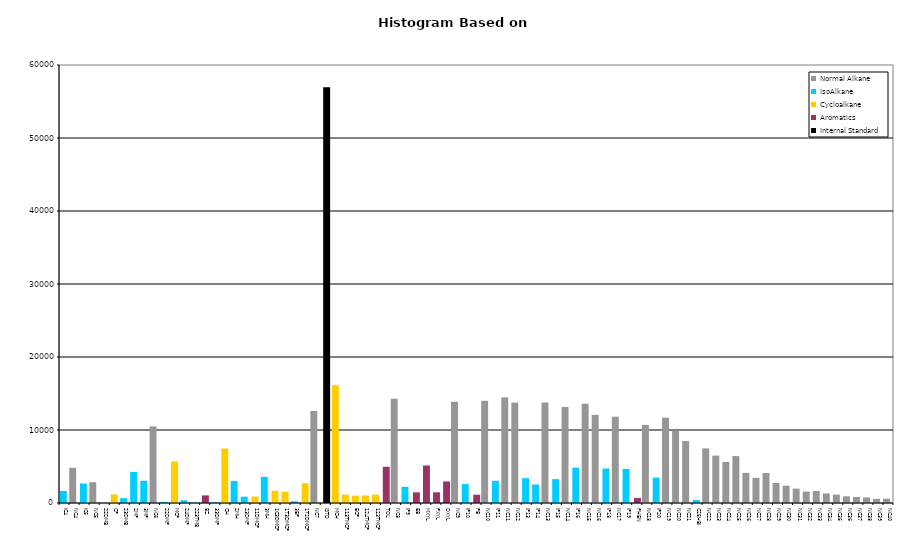
| Category | Normal Alkane | IsoAlkane | Cycloalkane | Aromatics | Internal Standard |
|---|---|---|---|---|---|
| IC4 | 0 | 1652 | 0 | 0 | 0 |
| NC4 | 4818 | 0 | 0 | 0 | 0 |
| IC5 | 0 | 2674 | 0 | 0 | 0 |
| NC5 | 2843 | 0 | 0 | 0 | 0 |
| 22DMB | 0 | 0 | 0 | 0 | 0 |
| CP | 0 | 0 | 1186 | 0 | 0 |
| 23DMB | 0 | 660 | 0 | 0 | 0 |
| 2MP | 0 | 4242 | 0 | 0 | 0 |
| 3MP | 0 | 3038 | 0 | 0 | 0 |
| NC6 | 10497 | 0 | 0 | 0 | 0 |
| 22DMP | 0 | 163 | 0 | 0 | 0 |
| MCP | 0 | 0 | 5683 | 0 | 0 |
| 24DMP | 0 | 377 | 0 | 0 | 0 |
| 223TMB | 0 | 57 | 0 | 0 | 0 |
| BZ | 0 | 0 | 0 | 1045 | 0 |
| 33DMP | 0 | 132 | 0 | 0 | 0 |
| CH | 0 | 0 | 7453 | 0 | 0 |
| 2MH | 0 | 3028 | 0 | 0 | 0 |
| 23DMP | 0 | 865 | 0 | 0 | 0 |
| 11DMCP | 0 | 0 | 888 | 0 | 0 |
| 3MH | 0 | 3582 | 0 | 0 | 0 |
| 1C3DMCP | 0 | 0 | 1687 | 0 | 0 |
| 1T3DMCP | 0 | 0 | 1529 | 0 | 0 |
| 3EP | 0 | 247 | 0 | 0 | 0 |
| 1T2DMCP | 0 | 0 | 2718 | 0 | 0 |
| NC7 | 12605 | 0 | 0 | 0 | 0 |
| ISTD | 0 | 0 | 0 | 0 | 56946 |
| MCH | 0 | 0 | 16136 | 0 | 0 |
| 113TMCP | 0 | 0 | 1162 | 0 | 0 |
| ECP | 0 | 0 | 1008 | 0 | 0 |
| 124TMCP | 0 | 0 | 1038 | 0 | 0 |
| 123TMCP | 0 | 0 | 1155 | 0 | 0 |
| TOL | 0 | 0 | 0 | 4962 | 0 |
| NC8 | 14287 | 0 | 0 | 0 | 0 |
| IP9 | 0 | 2217 | 0 | 0 | 0 |
| EB | 0 | 0 | 0 | 1460 | 0 |
| MXYL | 0 | 0 | 0 | 5137 | 0 |
| PXYL | 0 | 0 | 0 | 1464 | 0 |
| OXYL | 0 | 0 | 0 | 2949 | 0 |
| NC9 | 13864 | 0 | 0 | 0 | 0 |
| IP10 | 0 | 2589 | 0 | 0 | 0 |
| PB | 0 | 0 | 0 | 1138 | 0 |
| NC10 | 13997 | 0 | 0 | 0 | 0 |
| IP11 | 0 | 3040 | 0 | 0 | 0 |
| NC11 | 14464 | 0 | 0 | 0 | 0 |
| NC12 | 13749 | 0 | 0 | 0 | 0 |
| IP13 | 0 | 3397 | 0 | 0 | 0 |
| IP14 | 0 | 2531 | 0 | 0 | 0 |
| NC13 | 13764 | 0 | 0 | 0 | 0 |
| IP15 | 0 | 3270 | 0 | 0 | 0 |
| NC14 | 13160 | 0 | 0 | 0 | 0 |
| IP16 | 0 | 4845 | 0 | 0 | 0 |
| NC15 | 13597 | 0 | 0 | 0 | 0 |
| NC16 | 12068 | 0 | 0 | 0 | 0 |
| IP18 | 0 | 4721 | 0 | 0 | 0 |
| NC17 | 11819 | 0 | 0 | 0 | 0 |
| IP19 | 0 | 4667 | 0 | 0 | 0 |
| PHEN | 0 | 0 | 0 | 692 | 0 |
| NC18 | 10699 | 0 | 0 | 0 | 0 |
| IP20 | 0 | 3473 | 0 | 0 | 0 |
| NC19 | 11689 | 0 | 0 | 0 | 0 |
| NC20 | 9907 | 0 | 0 | 0 | 0 |
| NC21 | 8499 | 0 | 0 | 0 | 0 |
| C25HBI | 0 | 421 | 0 | 0 | 0 |
| NC22 | 7476 | 0 | 0 | 0 | 0 |
| NC23 | 6491 | 0 | 0 | 0 | 0 |
| NC24 | 5622 | 0 | 0 | 0 | 0 |
| NC25 | 6426 | 0 | 0 | 0 | 0 |
| NC26 | 4126 | 0 | 0 | 0 | 0 |
| NC27 | 3449 | 0 | 0 | 0 | 0 |
| NC28 | 4110 | 0 | 0 | 0 | 0 |
| NC29 | 2744 | 0 | 0 | 0 | 0 |
| NC30 | 2367 | 0 | 0 | 0 | 0 |
| NC31 | 1970 | 0 | 0 | 0 | 0 |
| NC32 | 1562 | 0 | 0 | 0 | 0 |
| NC33 | 1651 | 0 | 0 | 0 | 0 |
| NC34 | 1310 | 0 | 0 | 0 | 0 |
| NC35 | 1148 | 0 | 0 | 0 | 0 |
| NC36 | 913 | 0 | 0 | 0 | 0 |
| NC37 | 830 | 0 | 0 | 0 | 0 |
| NC38 | 761 | 0 | 0 | 0 | 0 |
| NC39 | 573 | 0 | 0 | 0 | 0 |
| NC40 | 586 | 0 | 0 | 0 | 0 |